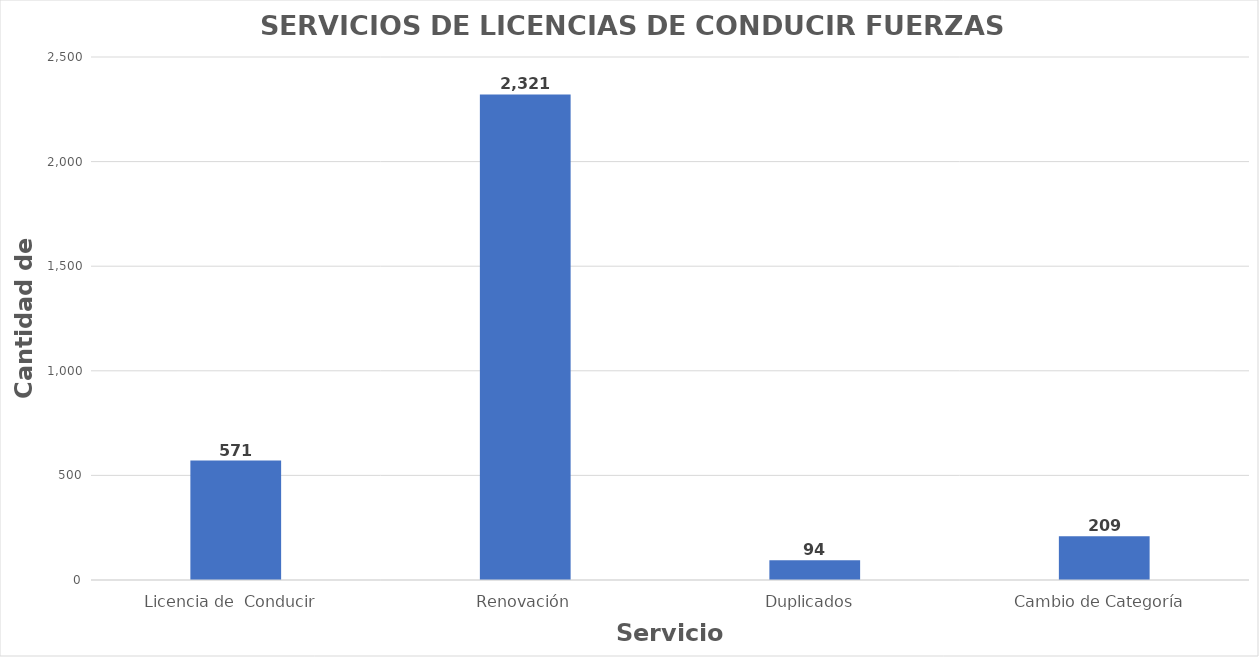
| Category | Series 0 |
|---|---|
| Licencia de  Conducir  | 571 |
| Renovación | 2321 |
| Duplicados  | 94 |
| Cambio de Categoría  | 209 |